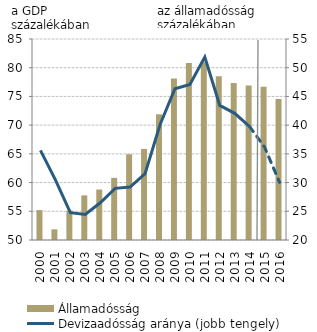
| Category | Államadósság |
|---|---|
| 2000.0 | 55.21 |
| 2001.0 | 51.858 |
| 2002.0 | 55.113 |
| 2003.0 | 57.777 |
| 2004.0 | 58.792 |
| 2005.0 | 60.823 |
| 2006.0 | 64.928 |
| 2007.0 | 65.858 |
| 2008.0 | 71.891 |
| 2009.0 | 78.127 |
| 2010.0 | 80.838 |
| 2011.0 | 80.963 |
| 2012.0 | 78.492 |
| 2013.0 | 77.336 |
| 2014.0 | 76.892 |
| 2015.0 | 76.685 |
| 2016.0 | 74.563 |